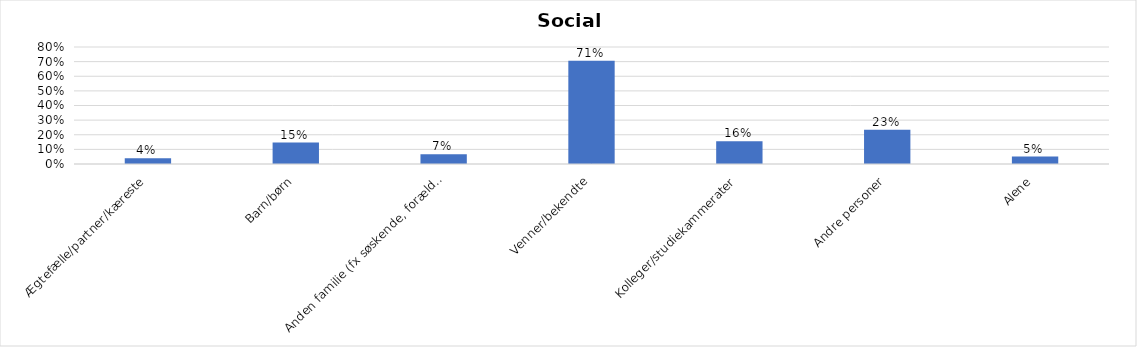
| Category | % |
|---|---|
| Ægtefælle/partner/kæreste | 0.039 |
| Barn/børn | 0.147 |
| Anden familie (fx søskende, forældre) | 0.066 |
| Venner/bekendte | 0.706 |
| Kolleger/studiekammerater | 0.155 |
| Andre personer | 0.233 |
| Alene | 0.051 |